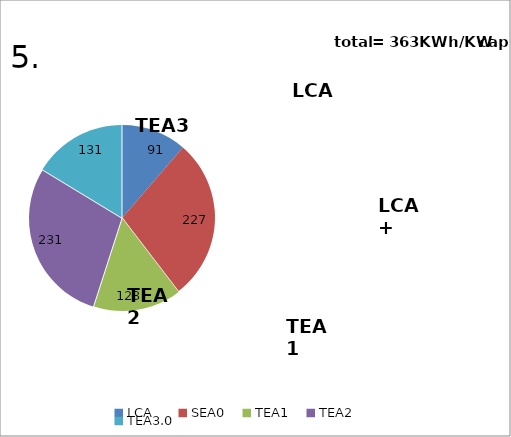
| Category | E Increment |
|---|---|
| LCA | 90.891 |
| SEA0 | 227.42 |
| TEA1 | 123.391 |
| TEA2 | 230.865 |
| TEA3.0 | 131.033 |